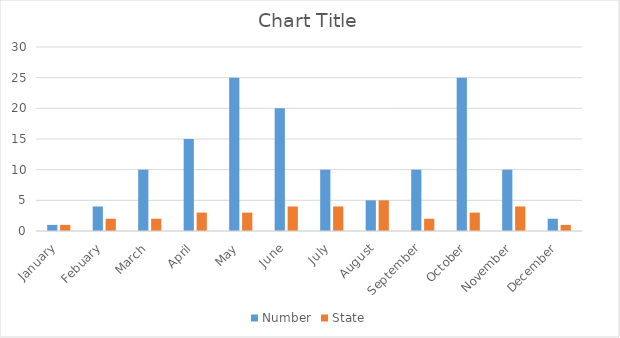
| Category | Number | State |
|---|---|---|
| January | 1 | 1 |
| Febuary | 4 | 2 |
| March | 10 | 2 |
| April | 15 | 3 |
| May | 25 | 3 |
| June | 20 | 4 |
| July | 10 | 4 |
| August | 5 | 5 |
| September | 10 | 2 |
| October | 25 | 3 |
| November | 10 | 4 |
| December | 2 | 1 |